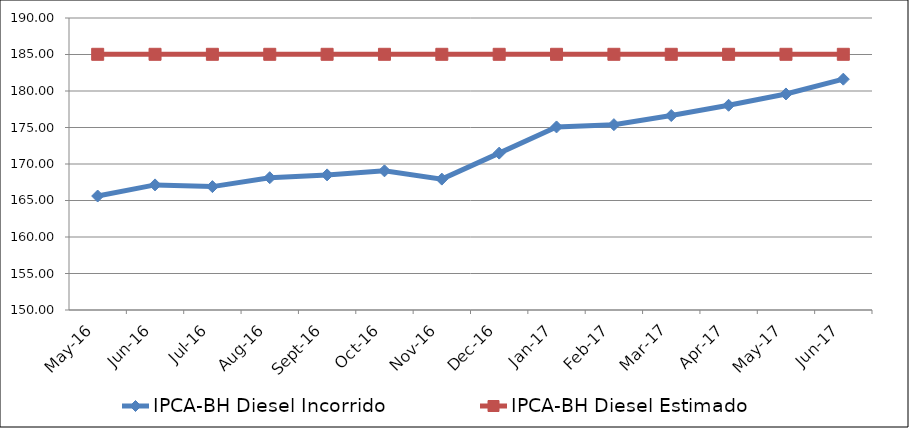
| Category | IPCA-BH Diesel Incorrido | IPCA-BH Diesel Estimado |
|---|---|---|
| 2016-05-01 | 165.613 | 185.027 |
| 2016-06-01 | 167.137 | 185.027 |
| 2016-07-01 | 166.903 | 185.027 |
| 2016-08-01 | 168.121 | 185.027 |
| 2016-09-01 | 168.508 | 185.027 |
| 2016-10-01 | 169.064 | 185.027 |
| 2016-11-01 | 167.931 | 185.027 |
| 2016-12-01 | 171.491 | 185.027 |
| 2017-01-01 | 175.075 | 185.027 |
| 2017-02-01 | 175.39 | 185.027 |
| 2017-03-01 | 176.642 | 185.027 |
| 2017-04-01 | 178.044 | 185.027 |
| 2017-05-01 | 179.595 | 185.027 |
| 2017-06-01 | 181.621 | 185.027 |